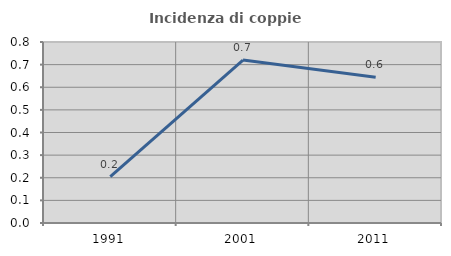
| Category | Incidenza di coppie miste |
|---|---|
| 1991.0 | 0.205 |
| 2001.0 | 0.72 |
| 2011.0 | 0.645 |